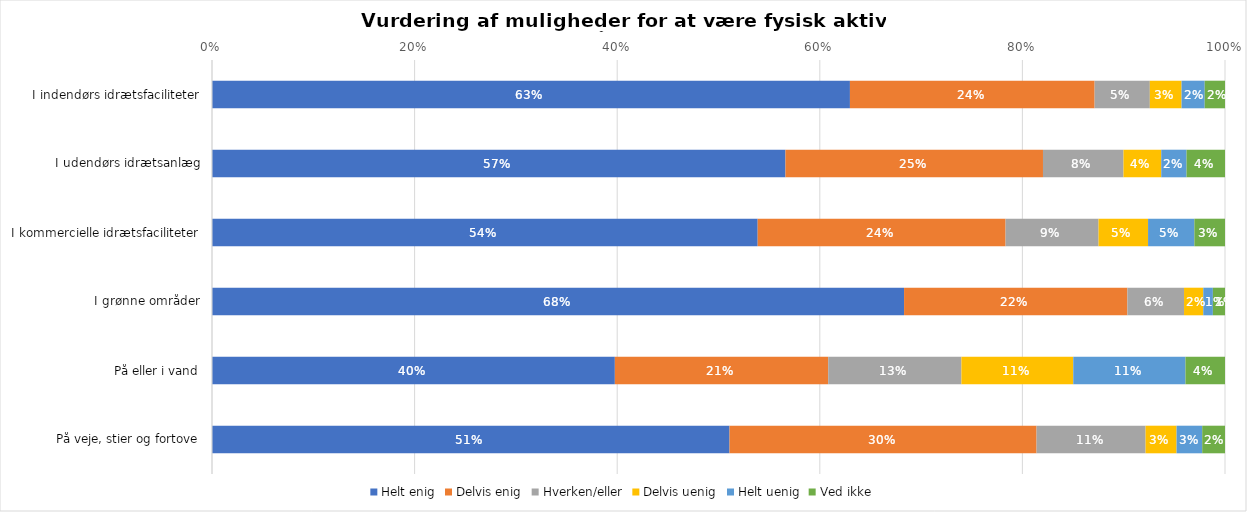
| Category | Helt enig | Delvis enig | Hverken/eller | Delvis uenig | Helt uenig | Ved ikke |
|---|---|---|---|---|---|---|
| I indendørs idrætsfaciliteter | 0.63 | 0.242 | 0.055 | 0.031 | 0.023 | 0.02 |
| I udendørs idrætsanlæg | 0.566 | 0.254 | 0.079 | 0.037 | 0.025 | 0.038 |
| I kommercielle idrætsfaciliteter | 0.539 | 0.245 | 0.092 | 0.049 | 0.046 | 0.03 |
| I grønne områder | 0.683 | 0.22 | 0.056 | 0.019 | 0.009 | 0.012 |
| På eller i vand | 0.398 | 0.211 | 0.132 | 0.11 | 0.111 | 0.039 |
| På veje, stier og fortove | 0.511 | 0.303 | 0.108 | 0.031 | 0.025 | 0.023 |